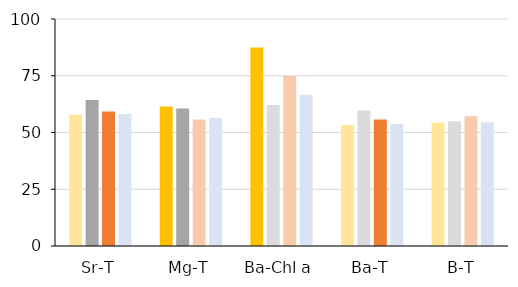
| Category | FO | IOM | ICE | GOM |
|---|---|---|---|---|
| Sr-T | 57.798 | 64.286 | 59.286 | 58.182 |
| Mg-T | 61.468 | 60.563 | 55.714 | 56.364 |
| Ba-Chl a | 87.5 | 62.162 | 75 | 66.667 |
| Ba-T | 53.333 | 59.722 | 55.714 | 53.704 |
| B-T | 54.412 | 54.93 | 57.143 | 54.545 |